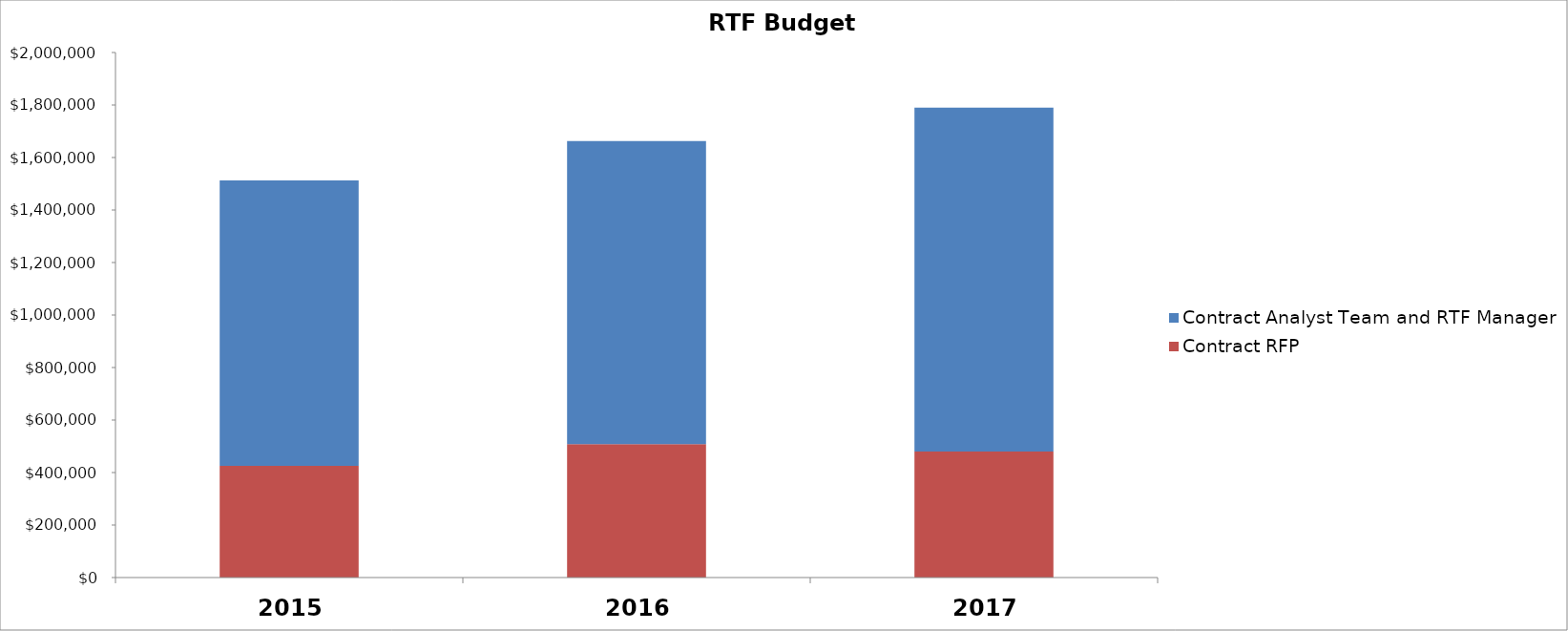
| Category | Contract RFP | Contract Analyst Team and RTF Manager |
|---|---|---|
| 2015.0 | 425600 | 1087000 |
| 2016.0 | 508000 | 1155000 |
| 2017.0 | 480300 | 1309500 |